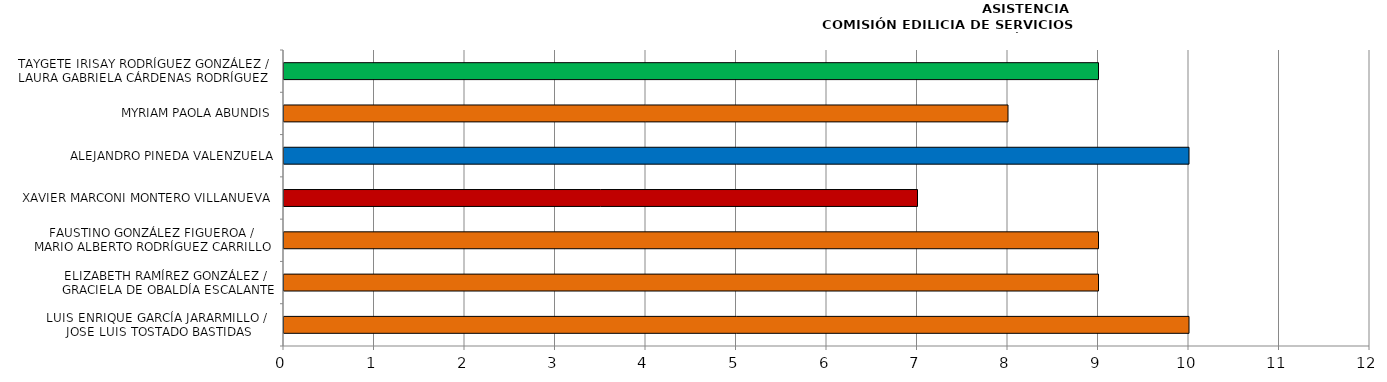
| Category | Series 0 |
|---|---|
| LUIS ENRIQUE GARCÍA JARARMILLO / 
JOSE LUIS TOSTADO BASTIDAS | 10 |
| ELIZABETH RAMÍREZ GONZÁLEZ /
 GRACIELA DE OBALDÍA ESCALANTE | 9 |
| FAUSTINO GONZÁLEZ FIGUEROA / 
MARIO ALBERTO RODRÍGUEZ CARRILLO | 9 |
| XAVIER MARCONI MONTERO VILLANUEVA | 7 |
| ALEJANDRO PINEDA VALENZUELA | 10 |
| MYRIAM PAOLA ABUNDIS | 8 |
| TAYGETE IRISAY RODRÍGUEZ GONZÁLEZ /
LAURA GABRIELA CÁRDENAS RODRÍGUEZ | 9 |